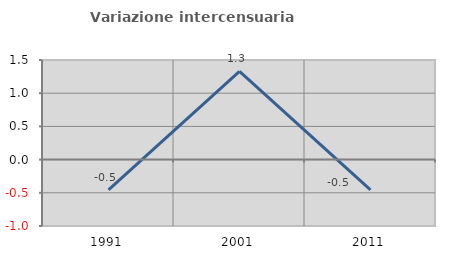
| Category | Variazione intercensuaria annua |
|---|---|
| 1991.0 | -0.456 |
| 2001.0 | 1.328 |
| 2011.0 | -0.455 |